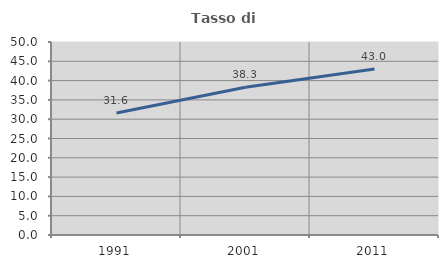
| Category | Tasso di occupazione   |
|---|---|
| 1991.0 | 31.583 |
| 2001.0 | 38.259 |
| 2011.0 | 42.978 |